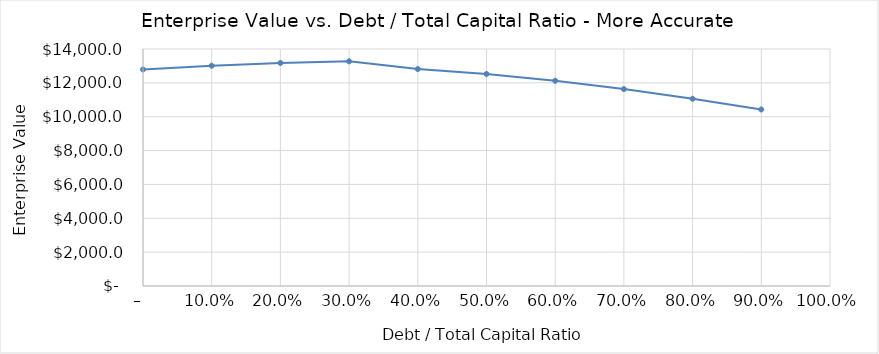
| Category | Series 0 |
|---|---|
| 0.0 | 12791.615 |
| 0.1 | 13011.896 |
| 0.2 | 13173.846 |
| 0.30000000000000004 | 13274.738 |
| 0.4 | 12816.123 |
| 0.5 | 12522.938 |
| 0.6 | 12123.637 |
| 0.7 | 11631.025 |
| 0.7999999999999999 | 11060.264 |
| 0.8999999999999999 | 10428.025 |